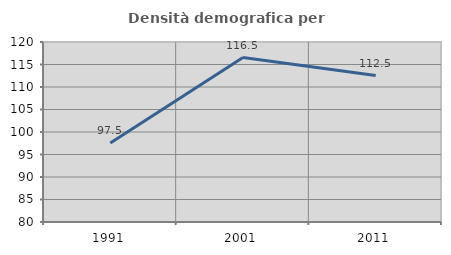
| Category | Densità demografica |
|---|---|
| 1991.0 | 97.532 |
| 2001.0 | 116.538 |
| 2011.0 | 112.537 |